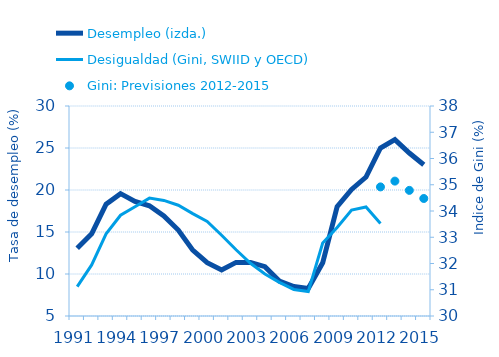
| Category |  Desempleo (izda.) |
|---|---|
| 1991.0 | 13.062 |
| 1992.0 | 14.78 |
| 1993.0 | 18.317 |
| 1994.0 | 19.57 |
| 1995.0 | 18.646 |
| 1996.0 | 18.125 |
| 1997.0 | 16.911 |
| 1998.0 | 15.234 |
| 1999.0 | 12.839 |
| 2000.0 | 11.343 |
| 2001.0 | 10.471 |
| 2002.0 | 11.382 |
| 2003.0 | 11.379 |
| 2004.0 | 10.867 |
| 2005.0 | 9.157 |
| 2006.0 | 8.511 |
| 2007.0 | 8.265 |
| 2008.0 | 11.338 |
| 2009.0 | 18.012 |
| 2010.0 | 20.063 |
| 2011.0 | 21.543 |
| 2012.0 | 25 |
| 2013.0 | 26 |
| 2014.0 | 24.4 |
| 2015.0 | 23 |